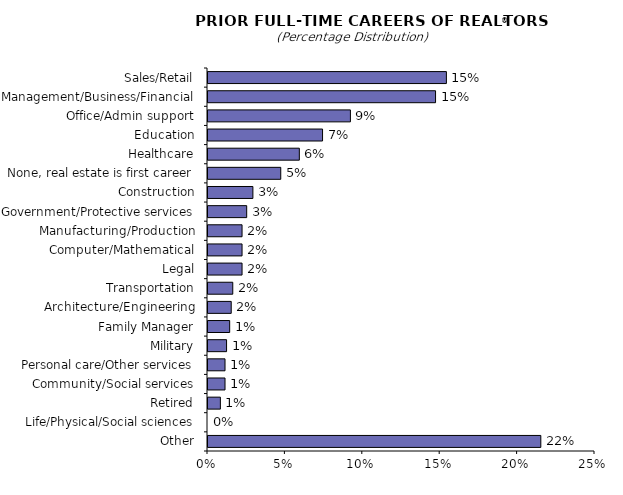
| Category | Series 0 |
|---|---|
| Sales/Retail | 15.4 |
| Management/Business/Financial | 14.7 |
| Office/Admin support | 9.2 |
| Education | 7.4 |
| Healthcare | 5.9 |
| None, real estate is first career | 4.7 |
| Construction | 2.9 |
| Government/Protective services | 2.5 |
| Manufacturing/Production | 2.2 |
| Computer/Mathematical | 2.2 |
| Legal | 2.2 |
| Transportation | 1.6 |
| Architecture/Engineering | 1.5 |
| Family Manager | 1.4 |
| Military | 1.2 |
| Personal care/Other services | 1.1 |
| Community/Social services | 1.1 |
| Retired | 0.8 |
| Life/Physical/Social sciences | 0 |
| Other | 21.5 |